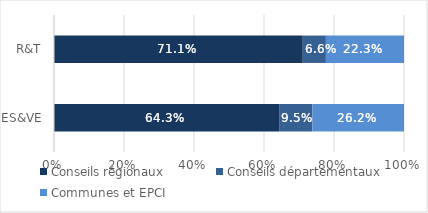
| Category | Conseils régionaux | Conseils départementaux | Communes et EPCI |
|---|---|---|---|
| ES&VE | 0.643 | 0.095 | 0.262 |
| R&T | 0.711 | 0.066 | 0.223 |